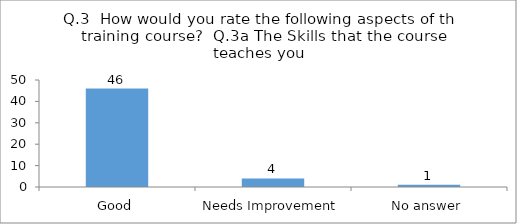
| Category | Q.3  How would you rate the following aspects of the training course?  |
|---|---|
| Good | 46 |
| Needs Improvement | 4 |
| No answer | 1 |